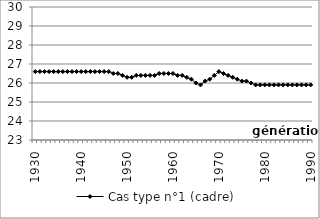
| Category | Cas type n°1 (cadre) |
|---|---|
| 1930.0 | 26.6 |
| 1931.0 | 26.6 |
| 1932.0 | 26.6 |
| 1933.0 | 26.6 |
| 1934.0 | 26.6 |
| 1935.0 | 26.6 |
| 1936.0 | 26.6 |
| 1937.0 | 26.6 |
| 1938.0 | 26.6 |
| 1939.0 | 26.6 |
| 1940.0 | 26.6 |
| 1941.0 | 26.6 |
| 1942.0 | 26.6 |
| 1943.0 | 26.6 |
| 1944.0 | 26.6 |
| 1945.0 | 26.6 |
| 1946.0 | 26.6 |
| 1947.0 | 26.5 |
| 1948.0 | 26.5 |
| 1949.0 | 26.4 |
| 1950.0 | 26.3 |
| 1951.0 | 26.3 |
| 1952.0 | 26.4 |
| 1953.0 | 26.4 |
| 1954.0 | 26.4 |
| 1955.0 | 26.4 |
| 1956.0 | 26.4 |
| 1957.0 | 26.5 |
| 1958.0 | 26.5 |
| 1959.0 | 26.5 |
| 1960.0 | 26.5 |
| 1961.0 | 26.4 |
| 1962.0 | 26.4 |
| 1963.0 | 26.3 |
| 1964.0 | 26.2 |
| 1965.0 | 26 |
| 1966.0 | 25.9 |
| 1967.0 | 26.1 |
| 1968.0 | 26.2 |
| 1969.0 | 26.4 |
| 1970.0 | 26.6 |
| 1971.0 | 26.5 |
| 1972.0 | 26.4 |
| 1973.0 | 26.3 |
| 1974.0 | 26.2 |
| 1975.0 | 26.1 |
| 1976.0 | 26.1 |
| 1977.0 | 26 |
| 1978.0 | 25.9 |
| 1979.0 | 25.9 |
| 1980.0 | 25.9 |
| 1981.0 | 25.9 |
| 1982.0 | 25.9 |
| 1983.0 | 25.9 |
| 1984.0 | 25.9 |
| 1985.0 | 25.9 |
| 1986.0 | 25.9 |
| 1987.0 | 25.9 |
| 1988.0 | 25.9 |
| 1989.0 | 25.9 |
| 1990.0 | 25.9 |